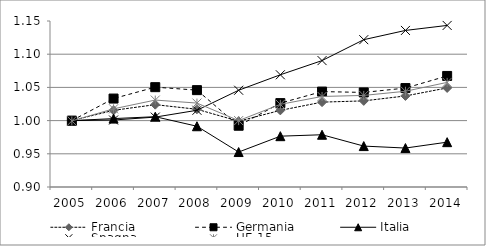
| Category | Francia | Germania | Italia | Spagna | UE 15 |
|---|---|---|---|---|---|
| 2005 | 1 | 1 | 1 | 1 | 1 |
| 2006 | 1.015 | 1.033 | 1.003 | 1.001 | 1.018 |
| 2007 | 1.024 | 1.05 | 1.006 | 1.005 | 1.031 |
| 2008 | 1.017 | 1.046 | 0.991 | 1.016 | 1.026 |
| 2009 | 0.999 | 0.992 | 0.953 | 1.046 | 1 |
| 2010 | 1.015 | 1.026 | 0.977 | 1.069 | 1.024 |
| 2011 | 1.028 | 1.044 | 0.979 | 1.09 | 1.036 |
| 2012 | 1.03 | 1.042 | 0.962 | 1.122 | 1.038 |
| 2013 | 1.037 | 1.049 | 0.959 | 1.136 | 1.044 |
| 2014 | 1.049 | 1.067 | 0.968 | 1.143 | 1.058 |